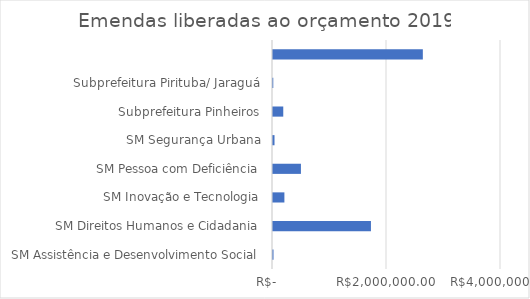
| Category | Series 0 |
|---|---|
| SM Assistência e Desenvolvimento Social | 9000 |
| SM Direitos Humanos e Cidadania | 1718300 |
| SM Inovação e Tecnologia | 200000 |
| SM Pessoa com Deficiência | 490000 |
| SM Segurança Urbana | 26450 |
| Subprefeitura Pinheiros | 180000 |
| Subprefeitura Pirituba/ Jaraguá | 5000 |